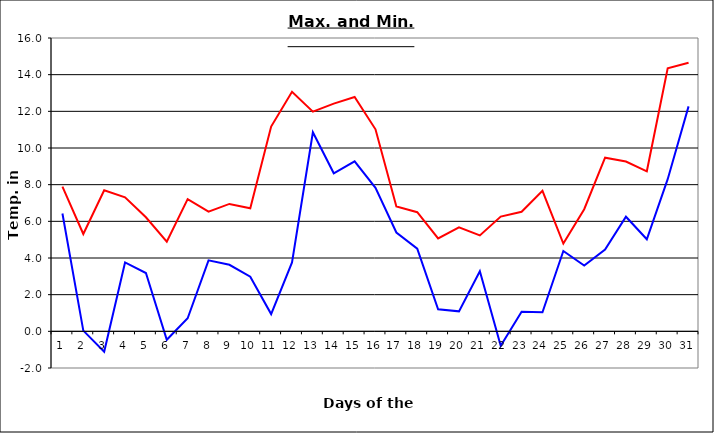
| Category | Series 0 | Series 1 |
|---|---|---|
| 0 | 7.89 | 6.43 |
| 1 | 5.31 | 0.04 |
| 2 | 7.69 | -1.11 |
| 3 | 7.31 | 3.76 |
| 4 | 6.22 | 3.18 |
| 5 | 4.89 | -0.46 |
| 6 | 7.21 | 0.71 |
| 7 | 6.53 | 3.87 |
| 8 | 6.95 | 3.63 |
| 9 | 6.71 | 2.98 |
| 10 | 11.17 | 0.94 |
| 11 | 13.07 | 3.76 |
| 12 | 11.98 | 10.86 |
| 13 | 12.42 | 8.62 |
| 14 | 12.78 | 9.27 |
| 15 | 11.02 | 7.83 |
| 16 | 6.81 | 5.39 |
| 17 | 6.5 | 4.51 |
| 18 | 5.07 | 1.2 |
| 19 | 5.67 | 1.09 |
| 20 | 5.23 | 3.28 |
| 21 | 6.26 | -0.79 |
| 22 | 6.52 | 1.07 |
| 23 | 7.66 | 1.04 |
| 24 | 4.79 | 4.38 |
| 25 | 6.66 | 3.59 |
| 26 | 9.47 | 4.46 |
| 27 | 9.26 | 6.25 |
| 28 | 8.73 | 5.02 |
| 29 | 14.35 | 8.3 |
| 30 | 14.65 | 12.27 |